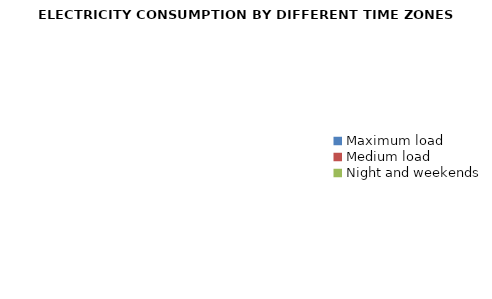
| Category | Series 0 |
|---|---|
| Maximum load | 0 |
| Medium load | 0 |
| Night and weekends | 0 |